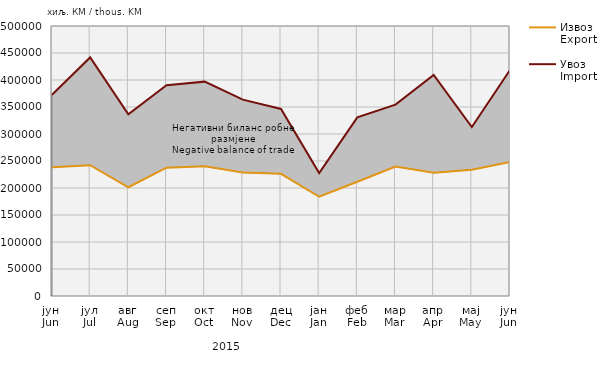
| Category | Извоз
Export | Увоз
Import |
|---|---|---|
| јун
Jun | 238401 | 372707 |
| јул
Jul | 242225 | 441833 |
| авг
Aug | 201367 | 336388 |
| сеп
Sep | 237597 | 390273 |
| окт
Oct | 240258 | 396961 |
| нов
Nov | 228539 | 363606 |
| дец
Dec | 226207 | 346357 |
| јан
Jan | 183779 | 227697 |
| феб
Feb | 211524 | 330765 |
| мар
Mar | 239782 | 354491 |
| апр
Apr | 228100 | 409414 |
| мај
May | 233872 | 312920 |
| јун
Jun | 248109 | 418421 |